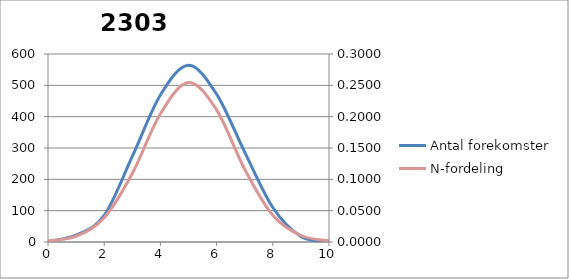
| Category | Antal forekomster |
|---|---|
| 0.0 | 2 |
| 1.0 | 22 |
| 2.0 | 85 |
| 3.0 | 273 |
| 4.0 | 469 |
| 5.0 | 564 |
| 6.0 | 472 |
| 7.0 | 287 |
| 8.0 | 110 |
| 9.0 | 18 |
| 10.0 | 1 |